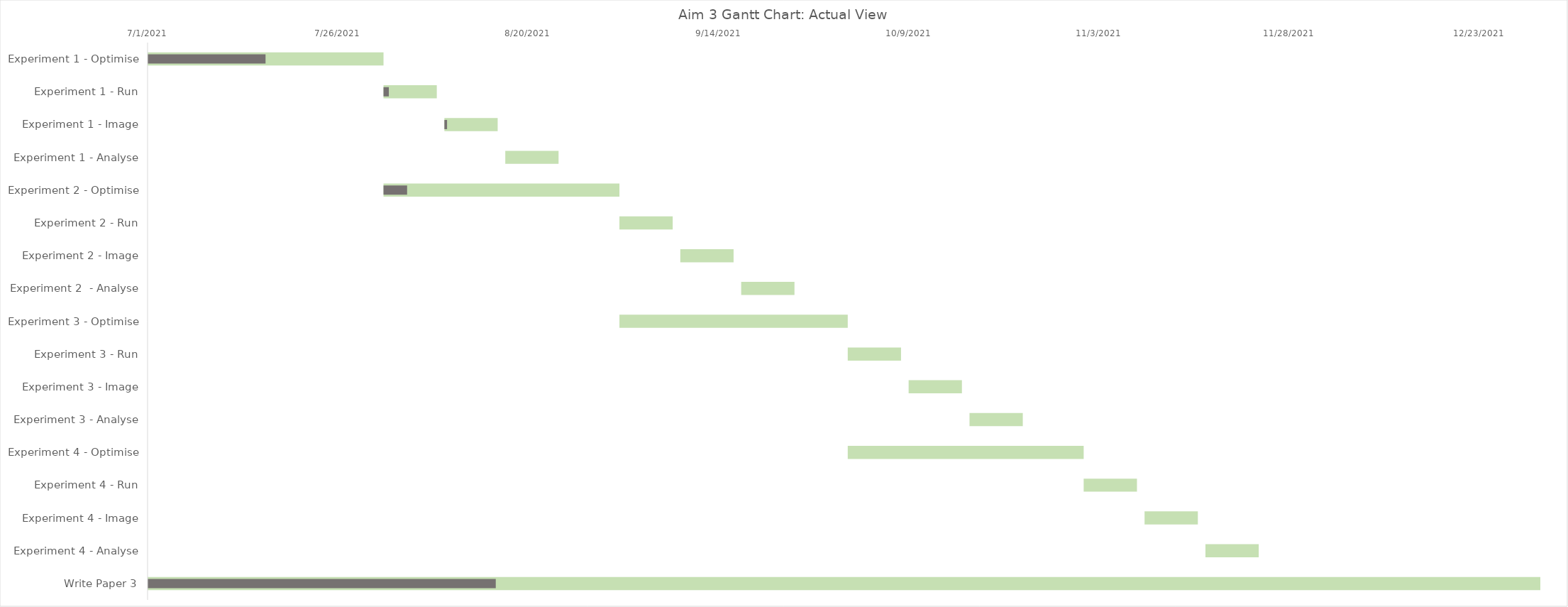
| Category | Start Date | # Days |
|---|---|---|
| Experiment 1 - Optimise | 7/1/21 | 31 |
| Experiment 1 - Run | 8/1/21 | 7 |
| Experiment 1 - Image | 8/9/21 | 7 |
| Experiment 1 - Analyse | 8/17/21 | 7 |
| Experiment 2 - Optimise | 8/1/21 | 31 |
| Experiment 2 - Run | 9/1/21 | 7 |
| Experiment 2 - Image | 9/9/21 | 7 |
| Experiment 2  - Analyse | 9/17/21 | 7 |
| Experiment 3 - Optimise | 9/1/21 | 30 |
| Experiment 3 - Run | 10/1/21 | 7 |
| Experiment 3 - Image | 10/9/21 | 7 |
| Experiment 3 - Analyse | 10/17/21 | 7 |
| Experiment 4 - Optimise | 10/1/21 | 31 |
| Experiment 4 - Run | 11/1/21 | 7 |
| Experiment 4 - Image | 11/9/21 | 7 |
| Experiment 4 - Analyse | 11/17/21 | 7 |
| Write Paper 3 | 7/1/21 | 183 |